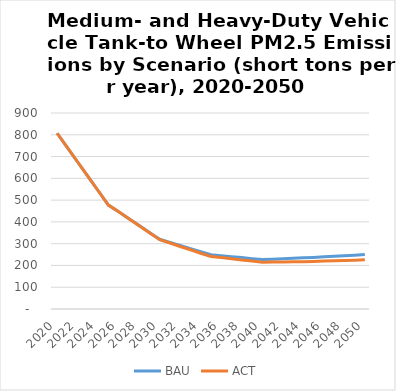
| Category | BAU | ACT |
|---|---|---|
| 2020.0 | 807 | 807 |
| 2021.0 | 741 | 741 |
| 2022.0 | 675 | 675 |
| 2023.0 | 609 | 609 |
| 2024.0 | 543 | 543 |
| 2025.0 | 477 | 477 |
| 2026.0 | 446 | 446 |
| 2027.0 | 414 | 414 |
| 2028.0 | 383 | 382 |
| 2029.0 | 351 | 350 |
| 2030.0 | 320 | 318 |
| 2031.0 | 306 | 303 |
| 2032.0 | 292 | 287 |
| 2033.0 | 277 | 272 |
| 2034.0 | 263 | 256 |
| 2035.0 | 249 | 241 |
| 2036.0 | 245 | 236 |
| 2037.0 | 240 | 231 |
| 2038.0 | 236 | 225 |
| 2039.0 | 231 | 220 |
| 2040.0 | 227 | 215 |
| 2041.0 | 229 | 216 |
| 2042.0 | 231 | 216 |
| 2043.0 | 233 | 217 |
| 2044.0 | 235 | 217 |
| 2045.0 | 237 | 218 |
| 2046.0 | 240 | 220 |
| 2047.0 | 242 | 221 |
| 2048.0 | 245 | 223 |
| 2049.0 | 247 | 224 |
| 2050.0 | 250 | 226 |